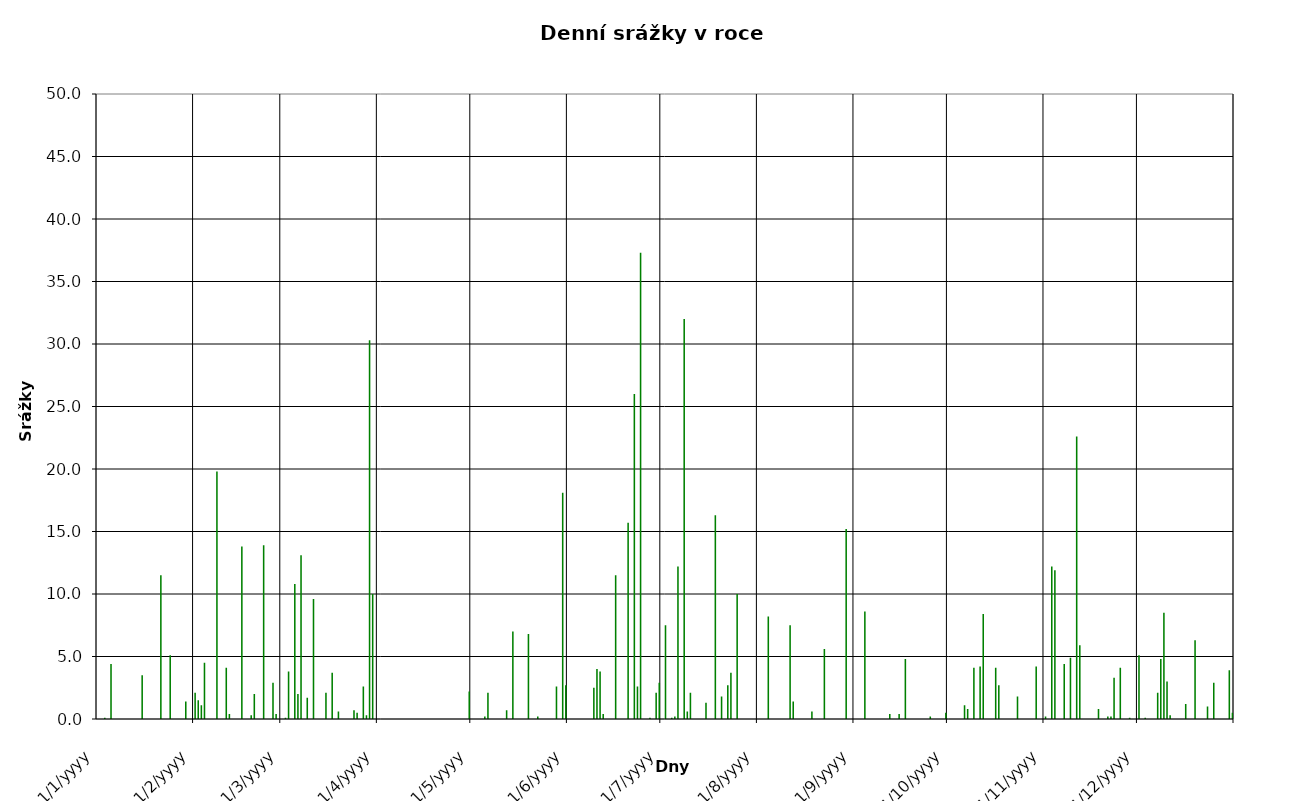
| Category | Series 0 |
|---|---|
| 2009-01-01 | 0 |
| 2009-01-02 | 0 |
| 2009-01-03 | 0.1 |
| 2009-01-04 | 0 |
| 2009-01-05 | 4.4 |
| 2009-01-06 | 0 |
| 2009-01-07 | 0 |
| 2009-01-08 | 0 |
| 2009-01-09 | 0 |
| 2009-01-10 | 0 |
| 2009-01-11 | 0 |
| 2009-01-12 | 0 |
| 2009-01-13 | 0 |
| 2009-01-14 | 0 |
| 2009-01-15 | 3.5 |
| 2009-01-16 | 0 |
| 2009-01-17 | 0 |
| 2009-01-18 | 0 |
| 2009-01-19 | 0 |
| 2009-01-20 | 0 |
| 2009-01-21 | 11.5 |
| 2009-01-22 | 0 |
| 2009-01-23 | 0 |
| 2009-01-24 | 5.1 |
| 2009-01-25 | 0 |
| 2009-01-26 | 0 |
| 2009-01-27 | 0 |
| 2009-01-28 | 0 |
| 2009-01-29 | 1.4 |
| 2009-01-30 | 0 |
| 2009-01-31 | 0 |
| 2009-02-01 | 2.1 |
| 2009-02-02 | 1.5 |
| 2009-02-03 | 1.1 |
| 2009-02-04 | 4.5 |
| 2009-02-05 | 0 |
| 2009-02-06 | 0 |
| 2009-02-07 | 0 |
| 2009-02-08 | 19.8 |
| 2009-02-09 | 0 |
| 2009-02-10 | 0 |
| 2009-02-11 | 4.1 |
| 2009-02-12 | 0.4 |
| 2009-02-13 | 0 |
| 2009-02-14 | 0 |
| 2009-02-15 | 0 |
| 2009-02-16 | 13.8 |
| 2009-02-17 | 0 |
| 2009-02-18 | 0 |
| 2009-02-19 | 0.3 |
| 2009-02-20 | 2 |
| 2009-02-21 | 0 |
| 2009-02-22 | 0 |
| 2009-02-23 | 13.9 |
| 2009-02-24 | 0 |
| 2009-02-25 | 0 |
| 2009-02-26 | 2.9 |
| 2009-02-27 | 0.4 |
| 2009-02-28 | 0 |
| 2009-03-01 | 0 |
| 2009-03-02 | 0.1 |
| 2009-03-03 | 3.8 |
| 2009-03-04 | 0 |
| 2009-03-05 | 10.8 |
| 2009-03-06 | 2 |
| 2009-03-07 | 13.1 |
| 2009-03-08 | 0 |
| 2009-03-09 | 1.7 |
| 2009-03-10 | 0 |
| 2009-03-11 | 9.6 |
| 2009-03-12 | 0 |
| 2009-03-13 | 0 |
| 2009-03-14 | 0 |
| 2009-03-15 | 2.1 |
| 2009-03-16 | 0 |
| 2009-03-17 | 3.7 |
| 2009-03-18 | 0 |
| 2009-03-19 | 0.6 |
| 2009-03-20 | 0 |
| 2009-03-21 | 0 |
| 2009-03-22 | 0 |
| 2009-03-23 | 0 |
| 2009-03-24 | 0.7 |
| 2009-03-25 | 0.5 |
| 2009-03-26 | 0 |
| 2009-03-27 | 2.6 |
| 2009-03-28 | 0.3 |
| 2009-03-29 | 30.3 |
| 2009-03-30 | 10 |
| 2009-03-31 | 0 |
| 2009-04-01 | 0 |
| 2009-04-02 | 0 |
| 2009-04-03 | 0 |
| 2009-04-04 | 0 |
| 2009-04-05 | 0 |
| 2009-04-06 | 0 |
| 2009-04-07 | 0 |
| 2009-04-08 | 0 |
| 2009-04-09 | 0 |
| 2009-04-10 | 0 |
| 2009-04-11 | 0 |
| 2009-04-12 | 0 |
| 2009-04-13 | 0 |
| 2009-04-14 | 0 |
| 2009-04-15 | 0 |
| 2009-04-16 | 0 |
| 2009-04-17 | 0 |
| 2009-04-18 | 0 |
| 2009-04-19 | 0 |
| 2009-04-20 | 0 |
| 2009-04-21 | 0 |
| 2009-04-22 | 0 |
| 2009-04-23 | 0 |
| 2009-04-24 | 0 |
| 2009-04-25 | 0 |
| 2009-04-26 | 0 |
| 2009-04-27 | 0 |
| 2009-04-28 | 0 |
| 2009-04-29 | 0 |
| 2009-04-30 | 2.2 |
| 2009-05-01 | 0 |
| 2009-05-02 | 0 |
| 2009-05-03 | 0 |
| 2009-05-04 | 0 |
| 2009-05-05 | 0.2 |
| 2009-05-06 | 2.1 |
| 2009-05-07 | 0 |
| 2009-05-08 | 0 |
| 2009-05-09 | 0 |
| 2009-05-10 | 0 |
| 2009-05-11 | 0 |
| 2009-05-12 | 0.7 |
| 2009-05-13 | 0 |
| 2009-05-14 | 7 |
| 2009-05-15 | 0 |
| 2009-05-16 | 0 |
| 2009-05-17 | 0 |
| 2009-05-18 | 0 |
| 2009-05-19 | 6.8 |
| 2009-05-20 | 0 |
| 2009-05-21 | 0 |
| 2009-05-22 | 0.2 |
| 2009-05-23 | 0 |
| 2009-05-24 | 0 |
| 2009-05-25 | 0 |
| 2009-05-26 | 0 |
| 2009-05-27 | 0 |
| 2009-05-28 | 2.6 |
| 2009-05-29 | 0 |
| 2009-05-30 | 18.1 |
| 2009-05-31 | 2.7 |
| 2009-06-01 | 0 |
| 2009-06-02 | 0 |
| 2009-06-03 | 0 |
| 2009-06-04 | 0 |
| 2009-06-05 | 0 |
| 2009-06-06 | 0 |
| 2009-06-07 | 0 |
| 2009-06-08 | 0 |
| 2009-06-09 | 2.5 |
| 2009-06-10 | 4 |
| 2009-06-11 | 3.8 |
| 2009-06-12 | 0.4 |
| 2009-06-13 | 0 |
| 2009-06-14 | 0 |
| 2009-06-15 | 0 |
| 2009-06-16 | 11.5 |
| 2009-06-17 | 0 |
| 2009-06-18 | 0 |
| 2009-06-19 | 0 |
| 2009-06-20 | 15.7 |
| 2009-06-21 | 0 |
| 2009-06-22 | 26 |
| 2009-06-23 | 2.6 |
| 2009-06-24 | 37.3 |
| 2009-06-25 | 0 |
| 2009-06-26 | 0 |
| 2009-06-27 | 0.1 |
| 2009-06-28 | 0 |
| 2009-06-29 | 2.1 |
| 2009-06-30 | 2.9 |
| 2009-07-01 | 0 |
| 2009-07-02 | 7.5 |
| 2009-07-03 | 0 |
| 2009-07-04 | 0.1 |
| 2009-07-05 | 0.2 |
| 2009-07-06 | 12.2 |
| 2009-07-07 | 0 |
| 2009-07-08 | 32 |
| 2009-07-09 | 0.6 |
| 2009-07-10 | 2.1 |
| 2009-07-11 | 0 |
| 2009-07-12 | 0 |
| 2009-07-13 | 0 |
| 2009-07-14 | 0 |
| 2009-07-15 | 1.3 |
| 2009-07-16 | 0 |
| 2009-07-17 | 0 |
| 2009-07-18 | 16.3 |
| 2009-07-19 | 0 |
| 2009-07-20 | 1.8 |
| 2009-07-21 | 0 |
| 2009-07-22 | 2.7 |
| 2009-07-23 | 3.7 |
| 2009-07-24 | 0 |
| 2009-07-25 | 10 |
| 2009-07-26 | 0 |
| 2009-07-27 | 0 |
| 2009-07-28 | 0 |
| 2009-07-29 | 0 |
| 2009-07-30 | 0 |
| 2009-07-31 | 0 |
| 2009-08-01 | 0 |
| 2009-08-02 | 0 |
| 2009-08-03 | 0 |
| 2009-08-04 | 8.2 |
| 2009-08-05 | 0 |
| 2009-08-06 | 0 |
| 2009-08-07 | 0 |
| 2009-08-08 | 0 |
| 2009-08-09 | 0 |
| 2009-08-10 | 0 |
| 2009-08-11 | 7.5 |
| 2009-08-12 | 1.4 |
| 2009-08-13 | 0 |
| 2009-08-14 | 0 |
| 2009-08-15 | 0 |
| 2009-08-16 | 0 |
| 2009-08-17 | 0 |
| 2009-08-18 | 0.6 |
| 2009-08-19 | 0 |
| 2009-08-20 | 0 |
| 2009-08-21 | 0 |
| 2009-08-22 | 5.6 |
| 2009-08-23 | 0 |
| 2009-08-24 | 0 |
| 2009-08-25 | 0 |
| 2009-08-26 | 0 |
| 2009-08-27 | 0 |
| 2009-08-28 | 0 |
| 2009-08-29 | 15.2 |
| 2009-08-30 | 0 |
| 2009-08-31 | 0 |
| 2009-09-01 | 0 |
| 2009-09-02 | 0 |
| 2009-09-03 | 0 |
| 2009-09-04 | 8.6 |
| 2009-09-05 | 0 |
| 2009-09-06 | 0 |
| 2009-09-07 | 0 |
| 2009-09-08 | 0 |
| 2009-09-09 | 0 |
| 2009-09-10 | 0 |
| 2009-09-11 | 0 |
| 2009-09-12 | 0.4 |
| 2009-09-13 | 0 |
| 2009-09-14 | 0 |
| 2009-09-15 | 0.4 |
| 2009-09-16 | 0 |
| 2009-09-17 | 4.8 |
| 2009-09-18 | 0 |
| 2009-09-19 | 0 |
| 2009-09-20 | 0 |
| 2009-09-21 | 0 |
| 2009-09-22 | 0 |
| 2009-09-23 | 0 |
| 2009-09-24 | 0 |
| 2009-09-25 | 0.2 |
| 2009-09-26 | 0 |
| 2009-09-27 | 0 |
| 2009-09-28 | 0 |
| 2009-09-29 | 0 |
| 2009-09-30 | 0.5 |
| 2009-10-01 | 0 |
| 2009-10-02 | 0 |
| 2009-10-03 | 0 |
| 2009-10-04 | 0 |
| 2009-10-05 | 0 |
| 2009-10-06 | 1.1 |
| 2009-10-07 | 0.8 |
| 2009-10-08 | 0 |
| 2009-10-09 | 4.1 |
| 2009-10-10 | 0 |
| 2009-10-11 | 4.2 |
| 2009-10-12 | 8.4 |
| 2009-10-13 | 0 |
| 2009-10-14 | 0 |
| 2009-10-15 | 0 |
| 2009-10-16 | 4.1 |
| 2009-10-17 | 2.7 |
| 2009-10-18 | 0 |
| 2009-10-19 | 0 |
| 2009-10-20 | 0 |
| 2009-10-21 | 0 |
| 2009-10-22 | 0 |
| 2009-10-23 | 1.8 |
| 2009-10-24 | 0 |
| 2009-10-25 | 0 |
| 2009-10-26 | 0 |
| 2009-10-27 | 0 |
| 2009-10-28 | 0 |
| 2009-10-29 | 4.2 |
| 2009-10-30 | 0 |
| 2009-10-31 | 0 |
| 2009-11-01 | 0.2 |
| 2009-11-02 | 0 |
| 2009-11-03 | 12.2 |
| 2009-11-04 | 11.9 |
| 2009-11-05 | 0 |
| 2009-11-06 | 0 |
| 2009-11-07 | 4.4 |
| 2009-11-08 | 0 |
| 2009-11-09 | 4.9 |
| 2009-11-10 | 0 |
| 2009-11-11 | 22.6 |
| 2009-11-12 | 5.9 |
| 2009-11-13 | 0 |
| 2009-11-14 | 0 |
| 2009-11-15 | 0 |
| 2009-11-16 | 0 |
| 2009-11-17 | 0 |
| 2009-11-18 | 0.8 |
| 2009-11-19 | 0 |
| 2009-11-20 | 0 |
| 2009-11-21 | 0.2 |
| 2009-11-22 | 0.2 |
| 2009-11-23 | 3.3 |
| 2009-11-24 | 0 |
| 2009-11-25 | 4.1 |
| 2009-11-26 | 0 |
| 2009-11-27 | 0 |
| 2009-11-28 | 0.1 |
| 2009-11-29 | 0 |
| 2009-11-30 | 0 |
| 2009-12-01 | 5.1 |
| 2009-12-02 | 0 |
| 2009-12-03 | 0.1 |
| 2009-12-04 | 0 |
| 2009-12-05 | 0 |
| 2009-12-06 | 0 |
| 2009-12-07 | 2.1 |
| 2009-12-08 | 4.8 |
| 2009-12-09 | 8.5 |
| 2009-12-10 | 3 |
| 2009-12-11 | 0.3 |
| 2009-12-12 | 0 |
| 2009-12-13 | 0 |
| 2009-12-14 | 0 |
| 2009-12-15 | 0 |
| 2009-12-16 | 1.2 |
| 2009-12-17 | 0 |
| 2009-12-18 | 0 |
| 2009-12-19 | 6.3 |
| 2009-12-20 | 0 |
| 2009-12-21 | 0 |
| 2009-12-22 | 0 |
| 2009-12-23 | 1 |
| 2009-12-24 | 0 |
| 2009-12-25 | 2.9 |
| 2009-12-26 | 0 |
| 2009-12-27 | 0 |
| 2009-12-28 | 0 |
| 2009-12-29 | 0 |
| 2009-12-30 | 3.9 |
| 2009-12-31 | 0.5 |